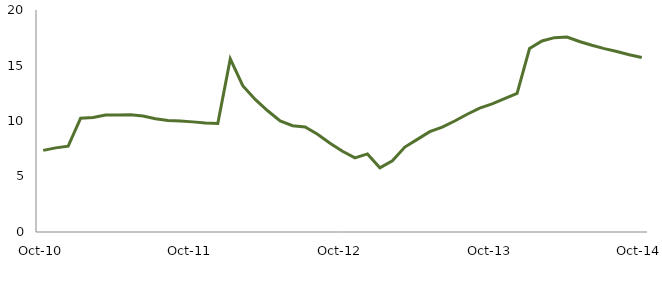
| Category | Series 0 |
|---|---|
| Oct-10 | 7.351 |
|  | 7.58 |
|  | 7.73 |
|  | 10.248 |
|  | 10.324 |
|  | 10.533 |
|  | 10.537 |
|  | 10.57 |
|  | 10.452 |
|  | 10.207 |
|  | 10.049 |
|  | 10.007 |
| Oct-11 | 9.921 |
|  | 9.825 |
|  | 9.769 |
|  | 15.6 |
|  | 13.183 |
|  | 11.939 |
|  | 10.922 |
|  | 10 |
|  | 9.58 |
|  | 9.469 |
|  | 8.808 |
|  | 7.988 |
| Oct-12 | 7.268 |
|  | 6.674 |
|  | 7.037 |
|  | 5.783 |
|  | 6.416 |
|  | 7.652 |
|  | 8.343 |
|  | 9.038 |
|  | 9.444 |
|  | 9.997 |
|  | 10.606 |
|  | 11.164 |
| Oct-13 | 11.55 |
|  | 12.014 |
|  | 12.486 |
|  | 16.529 |
|  | 17.207 |
|  | 17.508 |
|  | 17.569 |
|  | 17.163 |
|  | 16.827 |
|  | 16.521 |
|  | 16.256 |
|  | 15.969 |
| Oct-14 | 15.726 |